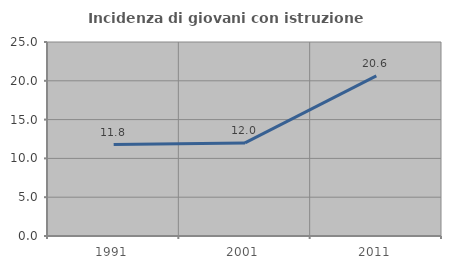
| Category | Incidenza di giovani con istruzione universitaria |
|---|---|
| 1991.0 | 11.776 |
| 2001.0 | 11.994 |
| 2011.0 | 20.625 |